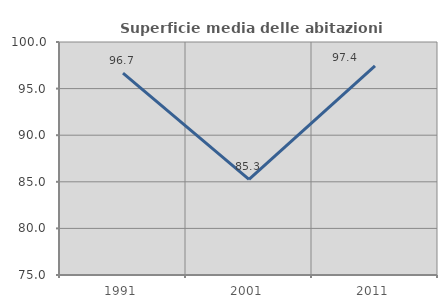
| Category | Superficie media delle abitazioni occupate |
|---|---|
| 1991.0 | 96.651 |
| 2001.0 | 85.255 |
| 2011.0 | 97.432 |